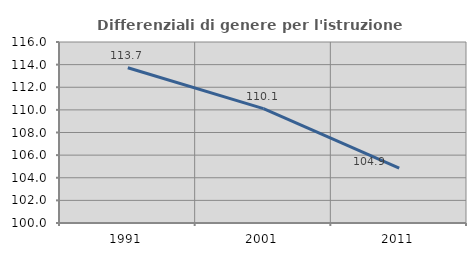
| Category | Differenziali di genere per l'istruzione superiore |
|---|---|
| 1991.0 | 113.724 |
| 2001.0 | 110.114 |
| 2011.0 | 104.857 |